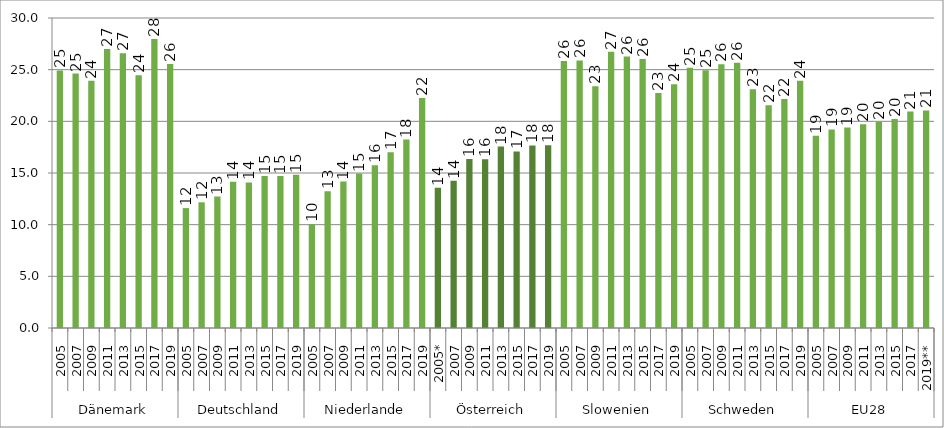
| Category | Frauenanteil in % |
|---|---|
| 0 | 24.926 |
| 1 | 24.623 |
| 2 | 23.938 |
| 3 | 27.007 |
| 4 | 26.596 |
| 5 | 24.467 |
| 6 | 27.958 |
| 7 | 25.545 |
| 8 | 11.603 |
| 9 | 12.167 |
| 10 | 12.722 |
| 11 | 14.163 |
| 12 | 14.082 |
| 13 | 14.719 |
| 14 | 14.707 |
| 15 | 14.836 |
| 16 | 10.038 |
| 17 | 13.245 |
| 18 | 14.167 |
| 19 | 14.944 |
| 20 | 15.741 |
| 21 | 17.013 |
| 22 | 18.236 |
| 23 | 22.254 |
| 24 | 13.568 |
| 25 | 14.239 |
| 26 | 16.348 |
| 27 | 16.342 |
| 28 | 17.561 |
| 29 | 17.088 |
| 30 | 17.662 |
| 31 | 17.696 |
| 32 | 25.828 |
| 33 | 25.888 |
| 34 | 23.401 |
| 35 | 26.725 |
| 36 | 26.268 |
| 37 | 26.042 |
| 38 | 22.734 |
| 39 | 23.582 |
| 40 | 25.193 |
| 41 | 24.942 |
| 42 | 25.525 |
| 43 | 25.657 |
| 44 | 23.116 |
| 45 | 21.553 |
| 46 | 22.153 |
| 47 | 23.932 |
| 48 | 18.597 |
| 49 | 19.217 |
| 50 | 19.393 |
| 51 | 19.721 |
| 52 | 19.959 |
| 53 | 20.221 |
| 54 | 20.941 |
| 55 | 21.053 |